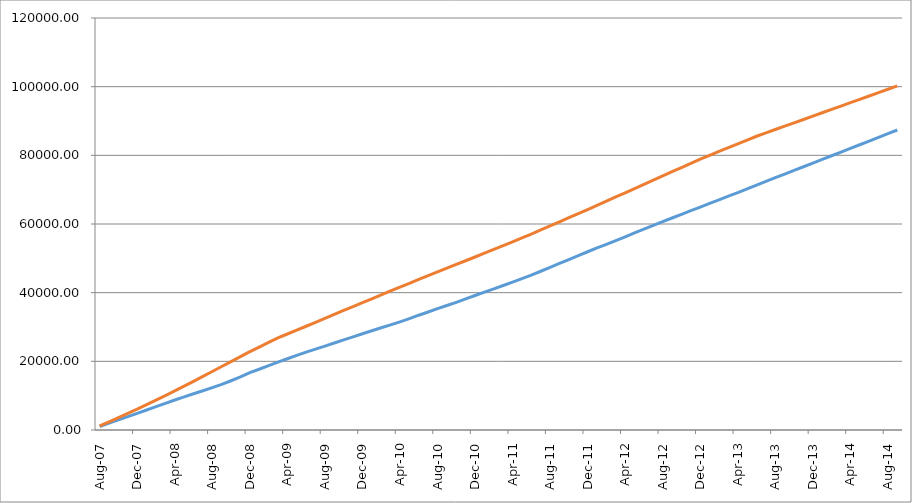
| Category | Series 0 | Series 1 |
|---|---|---|
| 2007-08-01 | 1006.471 | 1187.553 |
| 2007-09-01 | 1991.415 | 2375.106 |
| 2007-10-01 | 2938.621 | 3612.87 |
| 2007-11-01 | 3892.948 | 4850.635 |
| 2007-12-01 | 4847.583 | 6088.399 |
| 2008-01-01 | 5826.877 | 7402.068 |
| 2008-02-01 | 6800.695 | 8715.737 |
| 2008-03-01 | 7778.937 | 10029.406 |
| 2008-04-01 | 8725.526 | 11405.621 |
| 2008-05-01 | 9647.382 | 12781.835 |
| 2008-06-01 | 10571.239 | 14158.05 |
| 2008-07-01 | 11433.953 | 15601.721 |
| 2008-08-01 | 12336.454 | 17045.392 |
| 2008-09-01 | 13277.336 | 18489.063 |
| 2008-10-01 | 14348.499 | 19930.025 |
| 2008-11-01 | 15447.196 | 21370.987 |
| 2008-12-01 | 16685.047 | 22811.949 |
| 2009-01-01 | 17697.771 | 24153.225 |
| 2009-02-01 | 18752.911 | 25494.502 |
| 2009-03-01 | 19791.227 | 26835.778 |
| 2009-04-01 | 20747.59 | 27962.284 |
| 2009-05-01 | 21720.62 | 29088.79 |
| 2009-06-01 | 22673.291 | 30215.296 |
| 2009-07-01 | 23560.6 | 31374.386 |
| 2009-08-01 | 24439.674 | 32533.475 |
| 2009-09-01 | 25343.814 | 33692.565 |
| 2009-10-01 | 26248.087 | 34820.461 |
| 2009-11-01 | 27134.769 | 35948.358 |
| 2009-12-01 | 28024.705 | 37076.254 |
| 2010-01-01 | 28905.033 | 38214.835 |
| 2010-02-01 | 29767.507 | 39353.415 |
| 2010-03-01 | 30634.693 | 40491.995 |
| 2010-04-01 | 31511.27 | 41610.564 |
| 2010-05-01 | 32427.625 | 42729.132 |
| 2010-06-01 | 33434.785 | 43847.701 |
| 2010-07-01 | 34362.507 | 44939.644 |
| 2010-08-01 | 35339.915 | 46031.586 |
| 2010-09-01 | 36270.471 | 47123.529 |
| 2010-10-01 | 37187.472 | 48212.045 |
| 2010-11-01 | 38167.34 | 49300.562 |
| 2010-12-01 | 39174.495 | 50389.078 |
| 2011-01-01 | 40138.004 | 51490.097 |
| 2011-02-01 | 41115.25 | 52591.117 |
| 2011-03-01 | 42097.224 | 53692.136 |
| 2011-04-01 | 43071.046 | 54820.489 |
| 2011-05-01 | 44090.991 | 55948.842 |
| 2011-06-01 | 45125.804 | 57077.195 |
| 2011-07-01 | 46236.822 | 58263.136 |
| 2011-08-01 | 47366.528 | 59449.078 |
| 2011-09-01 | 48517.618 | 60635.02 |
| 2011-10-01 | 49641.621 | 61829.078 |
| 2011-11-01 | 50779.767 | 63023.137 |
| 2011-12-01 | 51919.688 | 64217.195 |
| 2012-01-01 | 53015.156 | 65437.926 |
| 2012-02-01 | 54083.83 | 66658.656 |
| 2012-03-01 | 55162.603 | 67879.387 |
| 2012-04-01 | 56256.075 | 69094.334 |
| 2012-05-01 | 57405.884 | 70309.282 |
| 2012-06-01 | 58513.401 | 71524.23 |
| 2012-07-01 | 59586.243 | 72761.069 |
| 2012-08-01 | 60677.306 | 73997.908 |
| 2012-09-01 | 61742.075 | 75234.748 |
| 2012-10-01 | 62811.544 | 76447.567 |
| 2012-11-01 | 63872.236 | 77660.386 |
| 2012-12-01 | 64926.808 | 78873.205 |
| 2013-01-01 | 65981.977 | 79998.313 |
| 2013-02-01 | 67037.8 | 81123.421 |
| 2013-03-01 | 68100.158 | 82248.529 |
| 2013-04-01 | 69159.73 | 83352.113 |
| 2013-05-01 | 70232.232 | 84455.697 |
| 2013-06-01 | 71326.825 | 85559.281 |
| 2013-07-01 | 72399.265 | 86539.208 |
| 2013-08-01 | 73481.177 | 87519.135 |
| 2013-09-01 | 74554.395 | 88499.062 |
| 2013-10-01 | 75611.817 | 89473.064 |
| 2013-11-01 | 76675.377 | 90447.066 |
| 2013-12-01 | 77733.298 | 91421.068 |
| 2014-01-01 | 78816.176 | 92398.984 |
| 2014-02-01 | 79882.851 | 93376.9 |
| 2014-03-01 | 80947.72 | 94354.815 |
| 2014-04-01 | 82020.409 | 95332.731 |
| 2014-05-01 | 83077.831 | 96310.647 |
| 2014-06-01 | 84144.85 | 97288.563 |
| 2014-07-01 | 85213.275 | 98263.594 |
| 2014-08-01 | 86299.16 | 99238.625 |
| 2014-09-01 | 87377.171 | 100213.656 |